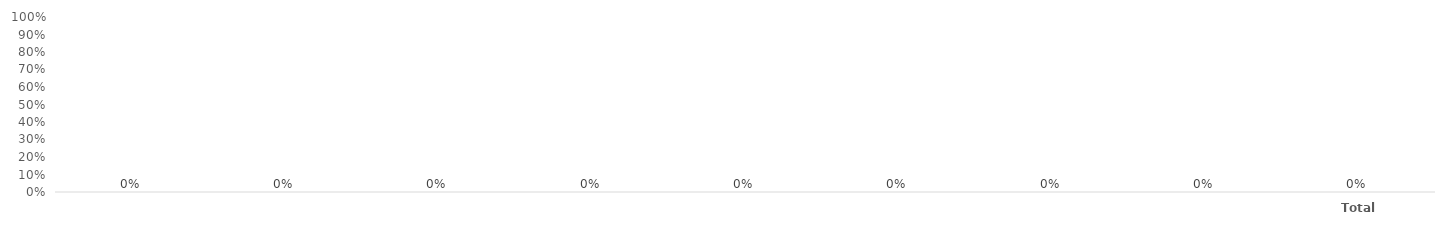
| Category | Percent tested |
|---|---|
|  | 0 |
|  | 0 |
|  | 0 |
|  | 0 |
|  | 0 |
|  | 0 |
|  | 0 |
|  | 0 |
| Total | 0 |